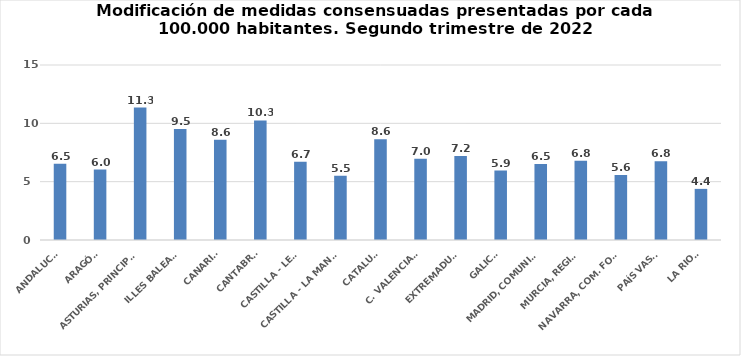
| Category | Series 0 |
|---|---|
| ANDALUCÍA | 6.546 |
| ARAGÓN | 6.036 |
| ASTURIAS, PRINCIPADO | 11.349 |
| ILLES BALEARS | 9.522 |
| CANARIAS | 8.592 |
| CANTABRIA | 10.253 |
| CASTILLA - LEÓN | 6.709 |
| CASTILLA - LA MANCHA | 5.506 |
| CATALUÑA | 8.634 |
| C. VALENCIANA | 6.973 |
| EXTREMADURA | 7.209 |
| GALICIA | 5.95 |
| MADRID, COMUNIDAD | 6.509 |
| MURCIA, REGIÓN | 6.791 |
| NAVARRA, COM. FORAL | 5.576 |
| PAÍS VASCO | 6.751 |
| LA RIOJA | 4.382 |